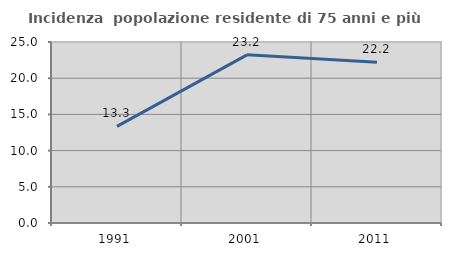
| Category | Incidenza  popolazione residente di 75 anni e più |
|---|---|
| 1991.0 | 13.342 |
| 2001.0 | 23.222 |
| 2011.0 | 22.206 |